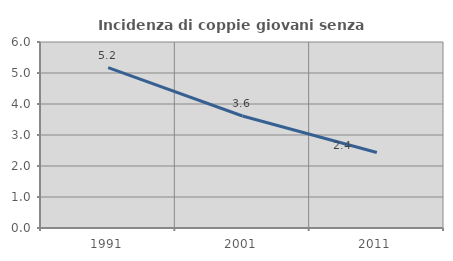
| Category | Incidenza di coppie giovani senza figli |
|---|---|
| 1991.0 | 5.175 |
| 2001.0 | 3.612 |
| 2011.0 | 2.437 |